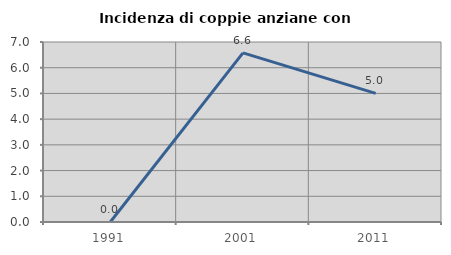
| Category | Incidenza di coppie anziane con figli |
|---|---|
| 1991.0 | 0 |
| 2001.0 | 6.579 |
| 2011.0 | 5 |